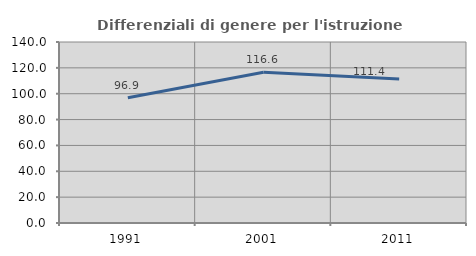
| Category | Differenziali di genere per l'istruzione superiore |
|---|---|
| 1991.0 | 96.908 |
| 2001.0 | 116.561 |
| 2011.0 | 111.401 |